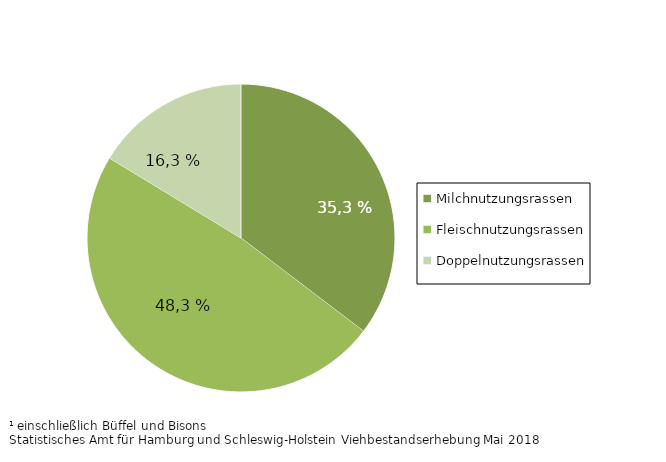
| Category | Series 0 |
|---|---|
| Milchnutzungsrassen | 35.349 |
| Fleischnutzungsrassen | 48.342 |
| Doppelnutzungsrassen | 16.309 |